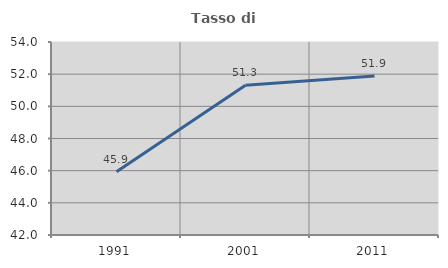
| Category | Tasso di occupazione   |
|---|---|
| 1991.0 | 45.93 |
| 2001.0 | 51.309 |
| 2011.0 | 51.892 |